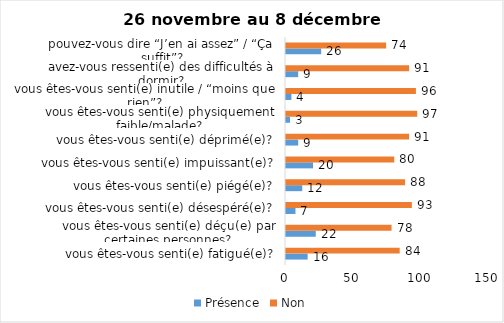
| Category | Présence | Non |
|---|---|---|
| vous êtes-vous senti(e) fatigué(e)? | 16 | 84 |
| vous êtes-vous senti(e) déçu(e) par certaines personnes? | 22 | 78 |
| vous êtes-vous senti(e) désespéré(e)? | 7 | 93 |
| vous êtes-vous senti(e) piégé(e)? | 12 | 88 |
| vous êtes-vous senti(e) impuissant(e)? | 20 | 80 |
| vous êtes-vous senti(e) déprimé(e)? | 9 | 91 |
| vous êtes-vous senti(e) physiquement faible/malade? | 3 | 97 |
| vous êtes-vous senti(e) inutile / “moins que rien”? | 4 | 96 |
| avez-vous ressenti(e) des difficultés à dormir? | 9 | 91 |
| pouvez-vous dire “J’en ai assez” / “Ça suffit”? | 26 | 74 |